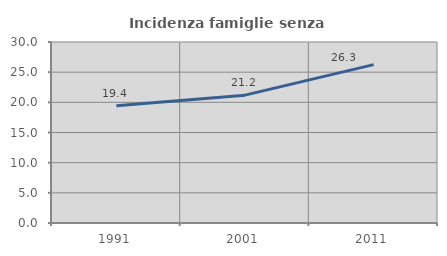
| Category | Incidenza famiglie senza nuclei |
|---|---|
| 1991.0 | 19.437 |
| 2001.0 | 21.188 |
| 2011.0 | 26.253 |